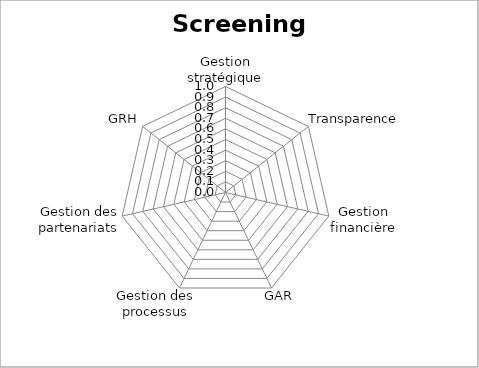
| Category | - - - - - - - |
|---|---|
| Gestion stratégique | 0 |
| Transparence | 0 |
| Gestion financière | 0 |
| GAR | 0 |
| Gestion des processus | 0 |
| Gestion des partenariats | 0 |
| GRH | 0 |